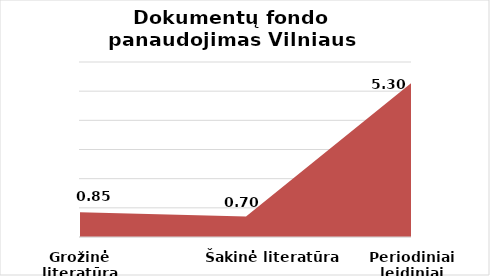
| Category | Series 0 |
|---|---|
| Grožinė literatūra | 0.85 |
| Šakinė literatūra | 0.702 |
| Periodiniai leidiniai | 5.3 |